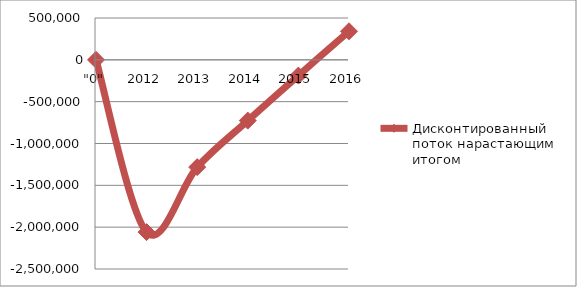
| Category | Дисконтированный поток нарастающим итогом |
|---|---|
| "0" | 0 |
| 2012 | -2059090.909 |
| 2013 | -1282145.722 |
| 2014 | -726037.536 |
| 2015 | -188301.37 |
| 2016 | 341278.991 |